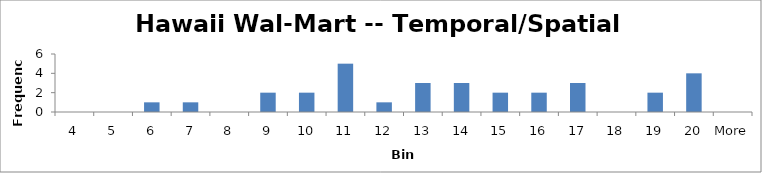
| Category | Frequency |
|---|---|
| 4 | 0 |
| 5 | 0 |
| 6 | 1 |
| 7 | 1 |
| 8 | 0 |
| 9 | 2 |
| 10 | 2 |
| 11 | 5 |
| 12 | 1 |
| 13 | 3 |
| 14 | 3 |
| 15 | 2 |
| 16 | 2 |
| 17 | 3 |
| 18 | 0 |
| 19 | 2 |
| 20 | 4 |
| More | 0 |